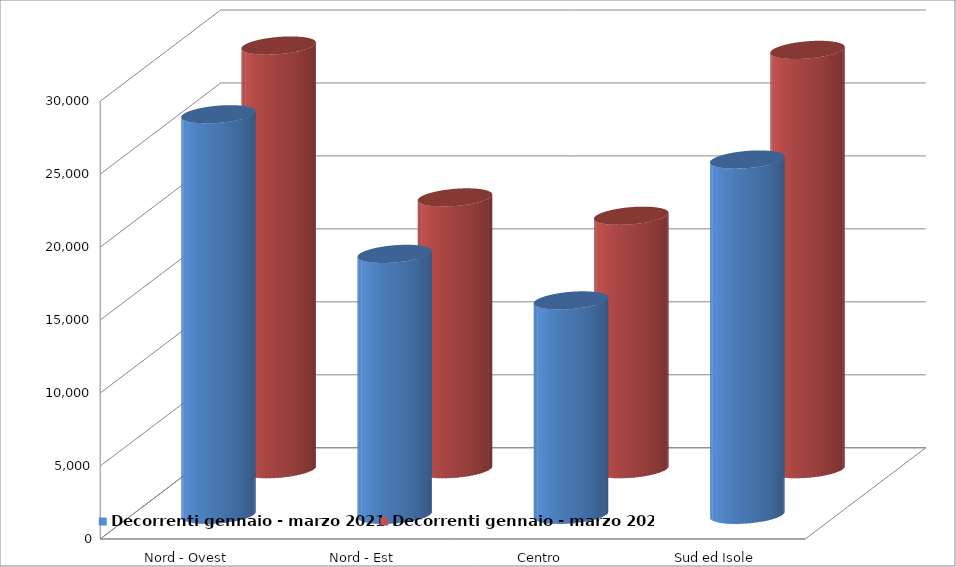
| Category | Decorrenti gennaio - marzo 2021 | Decorrenti gennaio - marzo 2020 |
|---|---|---|
| Nord - Ovest | 27450 | 29033 |
| Nord - Est | 17882 | 18623 |
| Centro | 14691 | 17368 |
| Sud ed Isole | 24348 | 28734 |